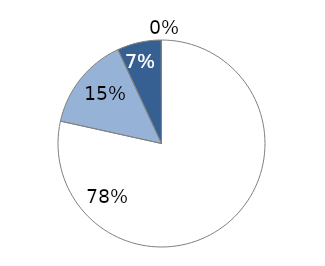
| Category | Electricity |
|---|---|
| EUR 0   | 0.785 |
| EUR 0-5   | 0.146 |
| EUR 5-30   | 0.069 |
| EUR >30 per tonne of CO2 | 0 |